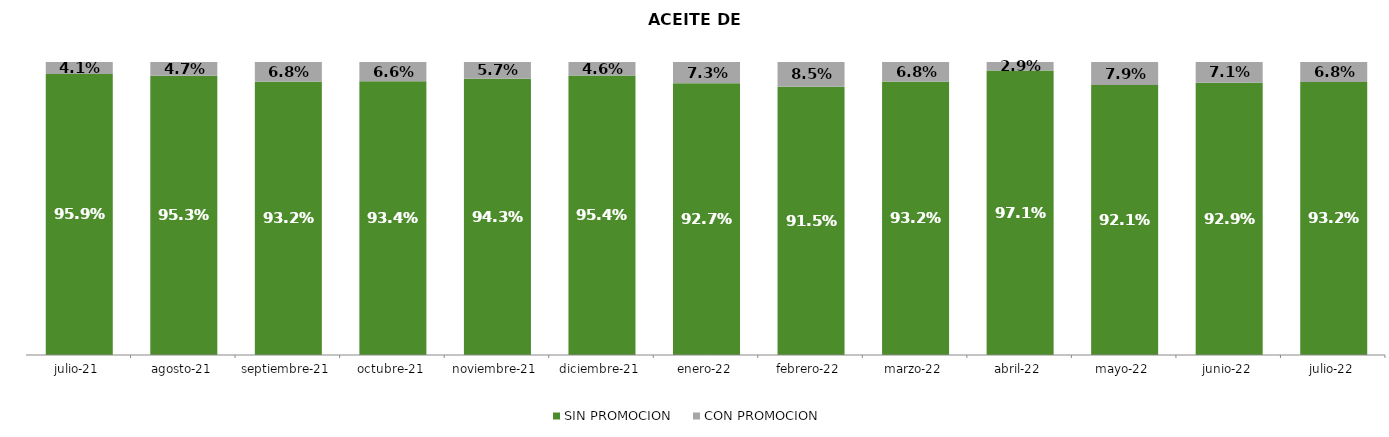
| Category | SIN PROMOCION   | CON PROMOCION   |
|---|---|---|
| 2021-07-01 | 0.959 | 0.041 |
| 2021-08-01 | 0.953 | 0.047 |
| 2021-09-01 | 0.932 | 0.068 |
| 2021-10-01 | 0.934 | 0.066 |
| 2021-11-01 | 0.943 | 0.057 |
| 2021-12-01 | 0.954 | 0.046 |
| 2022-01-01 | 0.927 | 0.073 |
| 2022-02-01 | 0.915 | 0.085 |
| 2022-03-01 | 0.932 | 0.068 |
| 2022-04-01 | 0.971 | 0.029 |
| 2022-05-01 | 0.921 | 0.079 |
| 2022-06-01 | 0.929 | 0.071 |
| 2022-07-01 | 0.932 | 0.068 |